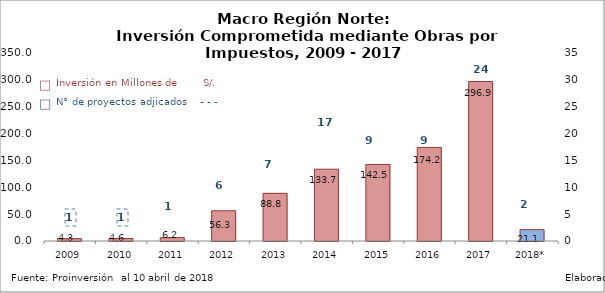
| Category | Inv. Total |
|---|---|
| 2009 | 4.339 |
| 2010 | 4.586 |
| 2011 | 6.235 |
| 2012 | 56.269 |
| 2013 | 88.75 |
| 2014 | 133.676 |
| 2015 | 142.452 |
| 2016 | 174.188 |
| 2017 | 296.917 |
| 2018* | 21.1 |